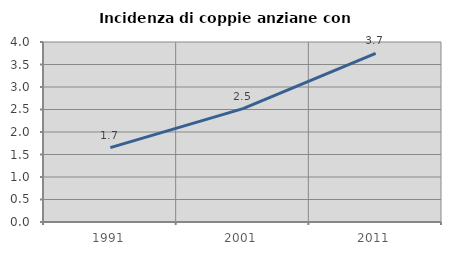
| Category | Incidenza di coppie anziane con figli |
|---|---|
| 1991.0 | 1.653 |
| 2001.0 | 2.52 |
| 2011.0 | 3.746 |